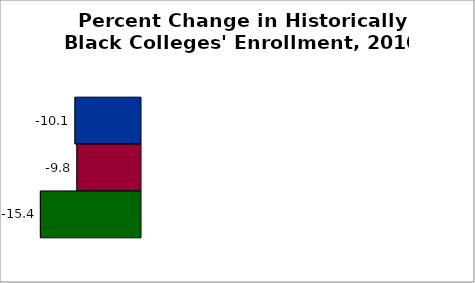
| Category | 50 states and D.C. | SREB states | State |
|---|---|---|---|
| 2010 to 2015 | -10.083 | -9.788 | -15.406 |